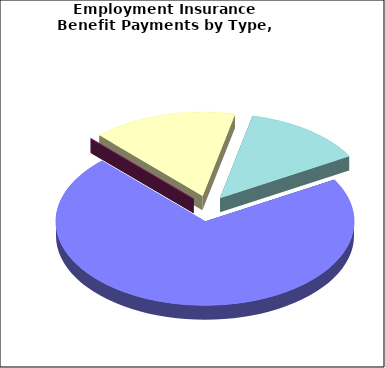
| Category | Series 0 |
|---|---|
| Regular benefits | 772124.42 |
| Work-sharing benefits | 48.26 |
| Fishing benefits | 169637.89 |
| Special benefits (includes Sickness, Maternity, Parental, Adoption, Compassion) | 142908.77 |